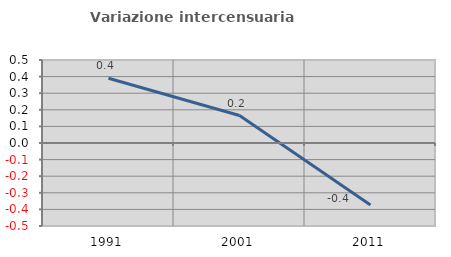
| Category | Variazione intercensuaria annua |
|---|---|
| 1991.0 | 0.39 |
| 2001.0 | 0.166 |
| 2011.0 | -0.374 |